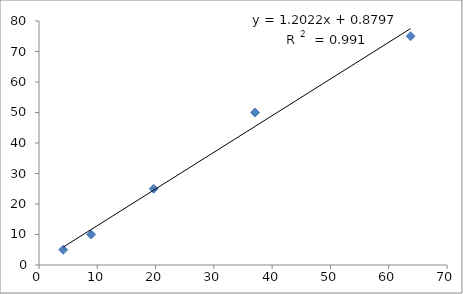
| Category | Series 0 |
|---|---|
| 4.158 | 5 |
| 8.955 | 10 |
| 19.672 | 25 |
| 37.065 | 50 |
| 63.743 | 75 |